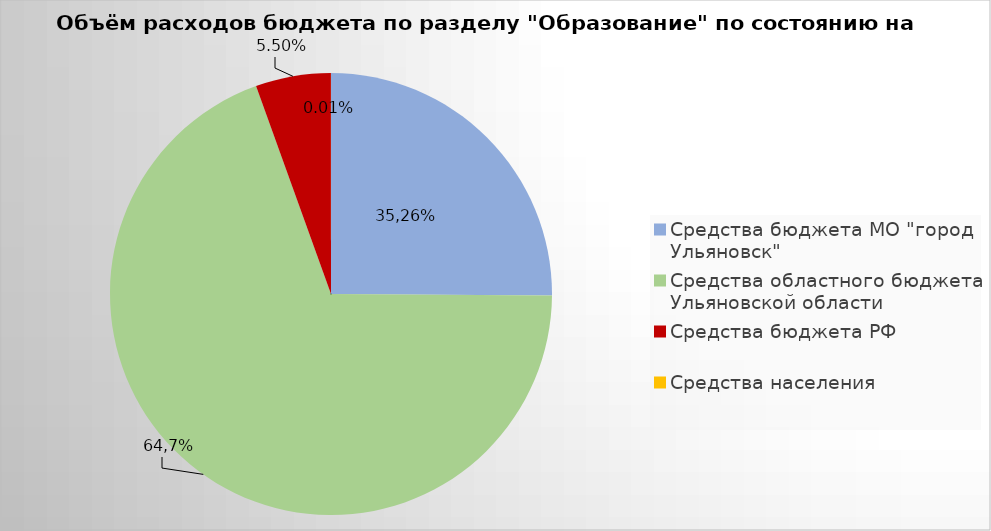
| Category | Series 0 |
|---|---|
| Средства бюджета МО "город Ульяновск" | 2200375.26 |
| Средства областного бюджета Ульяновской области | 6078657.67 |
| Средства бюджета РФ | 481889.61 |
| Средства населения | 558.01 |